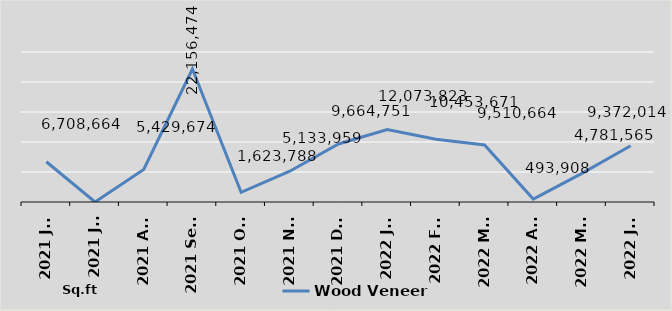
| Category | Wood Veneer |
|---|---|
| 2021 Jun | 6708664 |
| 2021 Jul | 0 |
| 2021 Aug | 5429674 |
| 2021 Sept | 22156474 |
| 2021 Oct | 1623788 |
| 2021 Nov | 5133959 |
| 2021 Dec | 9664751 |
| 2022 Jan | 12073823 |
| 2022 Feb | 10453671 |
| 2022 Mar | 9510664 |
| 2022 Apr | 493908 |
| 2022 May | 4781565 |
| 2022 Jun | 9372014 |